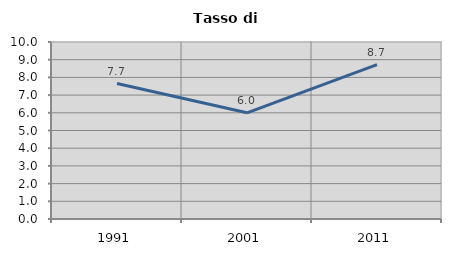
| Category | Tasso di disoccupazione   |
|---|---|
| 1991.0 | 7.651 |
| 2001.0 | 5.999 |
| 2011.0 | 8.718 |